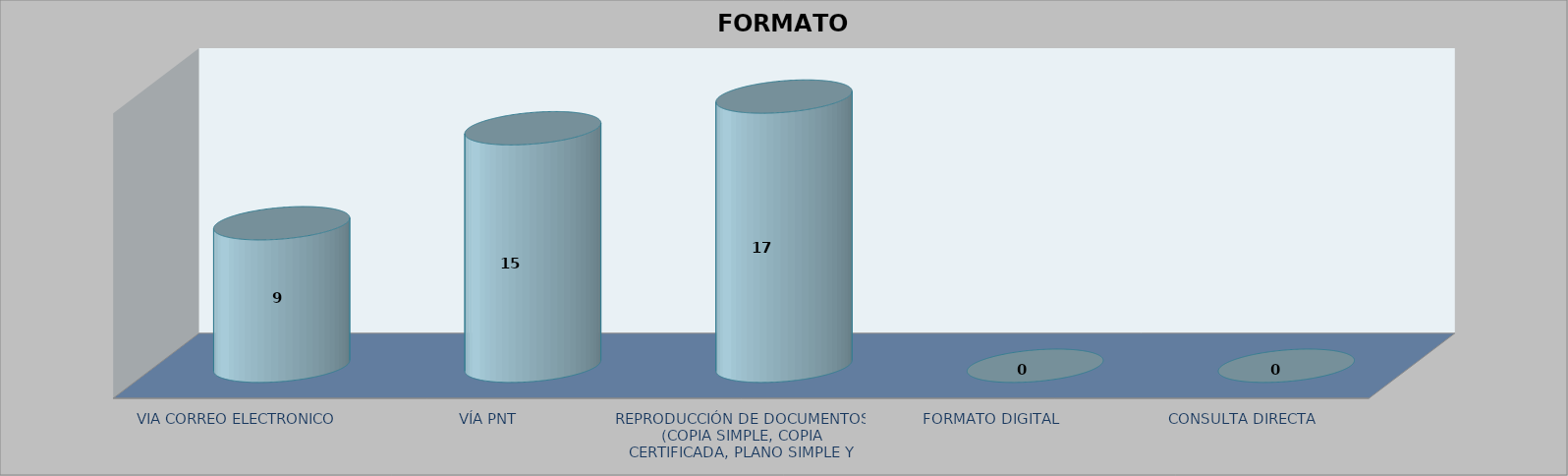
| Category |        FORMATO SOLICITADO | Series 1 | Series 2 |
|---|---|---|---|
| VIA CORREO ELECTRONICO |  |  | 9 |
| VÍA PNT |  |  | 15 |
| REPRODUCCIÓN DE DOCUMENTOS (COPIA SIMPLE, COPIA CERTIFICADA, PLANO SIMPLE Y PLANO CERTIFICADO) |  |  | 17 |
| FORMATO DIGITAL |  |  | 0 |
| CONSULTA DIRECTA |  |  | 0 |